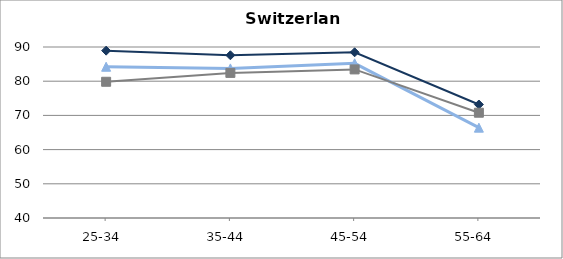
| Category | Work-study programmes | School-based programmes | General programmes |
|---|---|---|---|
| 25-34  | 88.932 | 84.226 | 79.833 |
| 35-44  | 87.583 | 83.744 | 82.43 |
| 45-54  | 88.452 | 85.233 | 83.447 |
| 55-64  | 73.183 | 66.416 | 70.785 |